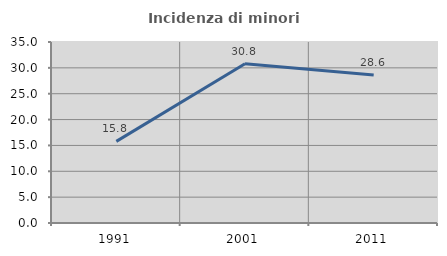
| Category | Incidenza di minori stranieri |
|---|---|
| 1991.0 | 15.789 |
| 2001.0 | 30.789 |
| 2011.0 | 28.634 |